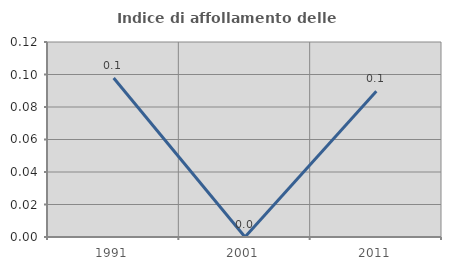
| Category | Indice di affollamento delle abitazioni  |
|---|---|
| 1991.0 | 0.098 |
| 2001.0 | 0 |
| 2011.0 | 0.09 |